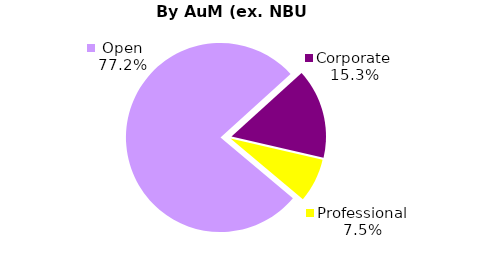
| Category | Series 0 |
|---|---|
| Open | 1635.937 |
| Corporate | 324.853 |
| Professional | 158.899 |